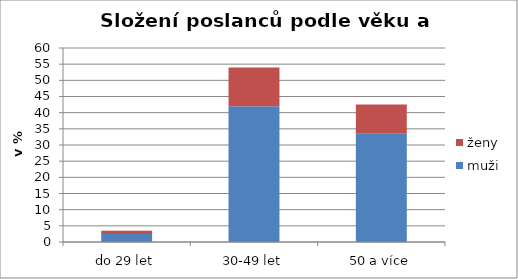
| Category | muži | ženy |
|---|---|---|
| do 29 let | 2.5 | 1 |
| 30-49 let | 42 | 12 |
| 50 a více | 33.5 | 9 |